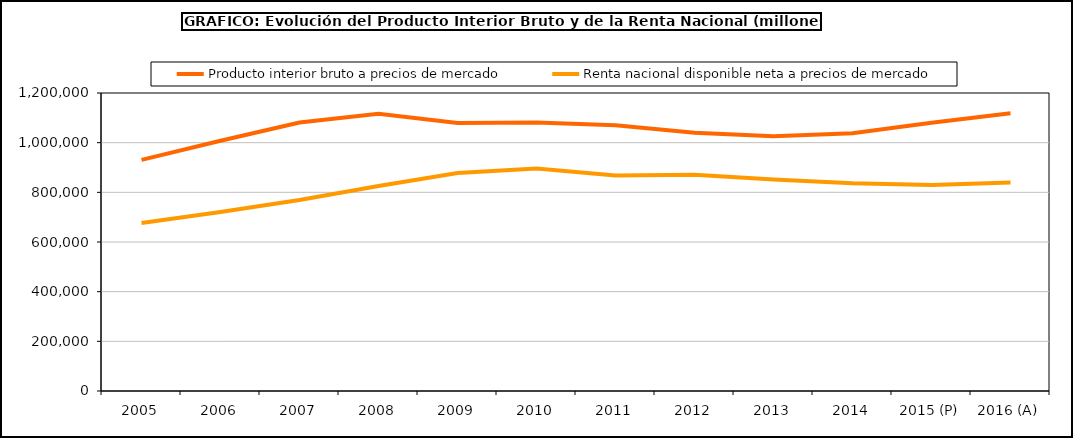
| Category | Producto interior bruto a precios de mercado | Renta nacional disponible neta a precios de mercado |
|---|---|---|
| 2005 | 930566 |  |
| 2006 | 1007974 |  |
| 2007 | 1080807 |  |
| 2008 | 1116225 |  |
| 2009 | 1079052 |  |
| 2010 | 1080935 |  |
| 2011 | 1070449 |  |
| 2012 | 1039815 |  |
| 2013 | 1025693 |  |
| 2014 | 1037820 |  |
| 2015 (P) | 1079998 |  |
| 2016 (A) | 1118522 |  |